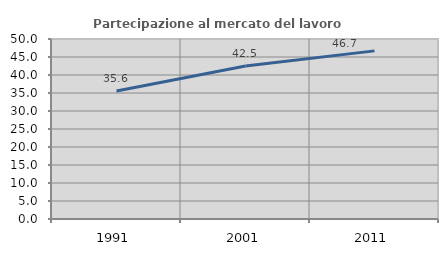
| Category | Partecipazione al mercato del lavoro  femminile |
|---|---|
| 1991.0 | 35.565 |
| 2001.0 | 42.487 |
| 2011.0 | 46.702 |